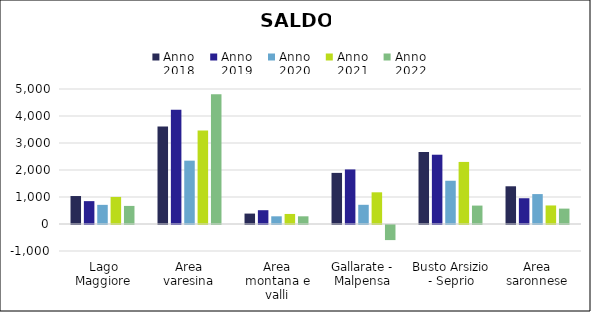
| Category | Anno
2018 | Anno
2019 | Anno
2020 | Anno
2021 | Anno
2022 |
|---|---|---|---|---|---|
| Lago Maggiore | 1036 | 847 | 709 | 1002 | 670 |
| Area varesina | 3615 | 4234 | 2346 | 3462 | 4809 |
| Area montana e valli | 386 | 511 | 285 | 372 | 285 |
| Gallarate - Malpensa | 1893 | 2021 | 711 | 1174 | -559 |
| Busto Arsizio - Seprio | 2666 | 2566 | 1602 | 2299 | 682 |
| Area saronnese | 1397 | 954 | 1108 | 687 | 570 |